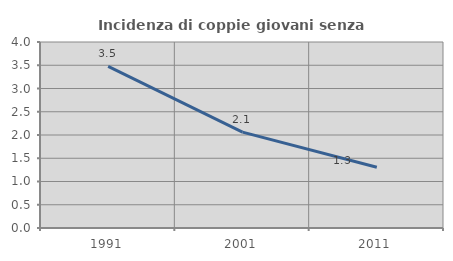
| Category | Incidenza di coppie giovani senza figli |
|---|---|
| 1991.0 | 3.474 |
| 2001.0 | 2.063 |
| 2011.0 | 1.305 |